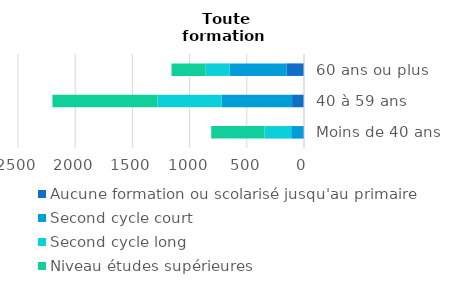
| Category | Aucune formation ou scolarisé jusqu'au primaire | Second cycle court | Second cycle long | Niveau études supérieures |
|---|---|---|---|---|
| Moins de 40 ans | 9 | 103 | 233 | 466 |
| 40 à 59 ans | 104 | 617 | 559 | 919 |
| 60 ans ou plus | 154 | 495 | 210 | 299 |